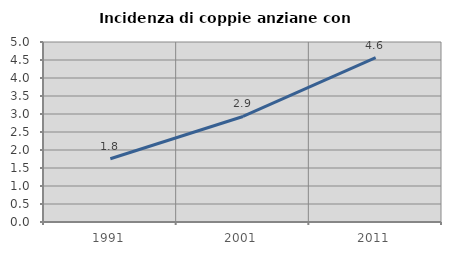
| Category | Incidenza di coppie anziane con figli |
|---|---|
| 1991.0 | 1.756 |
| 2001.0 | 2.932 |
| 2011.0 | 4.567 |